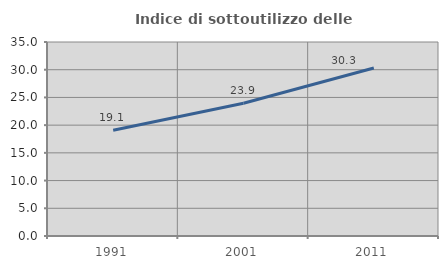
| Category | Indice di sottoutilizzo delle abitazioni  |
|---|---|
| 1991.0 | 19.065 |
| 2001.0 | 23.944 |
| 2011.0 | 30.321 |